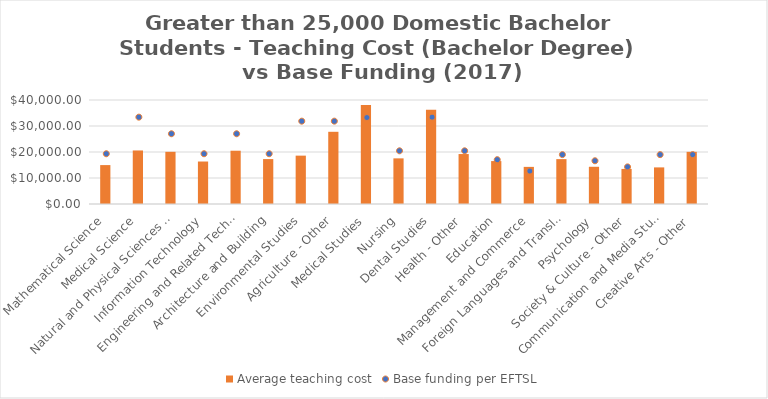
| Category | Average teaching cost |
|---|---|
| Mathematical Science | 14966.165 |
| Medical Science | 20591.13 |
| Natural and Physical Sciences - Other | 20067.672 |
| Information Technology | 16340.423 |
| Engineering and Related Technologies | 20491.134 |
| Architecture and Building | 17275.421 |
| Environmental Studies | 18598.82 |
| Agriculture - Other | 27770.507 |
| Medical Studies | 38042.026 |
| Nursing | 17553.445 |
| Dental Studies | 36235.746 |
| Health - Other | 19214.462 |
| Education | 16508.887 |
| Management and Commerce | 14277.263 |
| Foreign Languages and Translating | 17262.089 |
| Psychology | 14316.976 |
| Society & Culture - Other | 13484.381 |
| Communication and Media Studies | 14079.853 |
| Creative Arts - Other | 20061.956 |